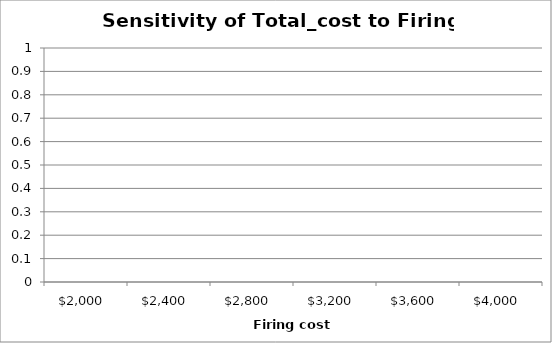
| Category | Series 0 |
|---|---|
| 2000.0 | 0 |
| 2400.0 | 0 |
| 2800.0 | 0 |
| 3200.0 | 0 |
| 3600.0 | 0 |
| 4000.0 | 0 |